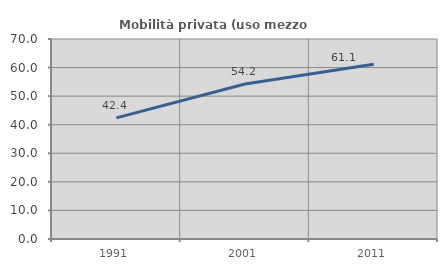
| Category | Mobilità privata (uso mezzo privato) |
|---|---|
| 1991.0 | 42.377 |
| 2001.0 | 54.23 |
| 2011.0 | 61.128 |